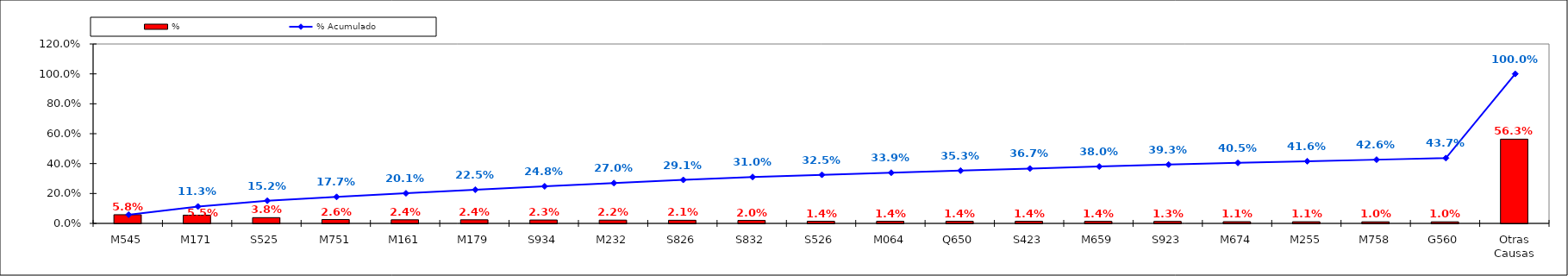
| Category | % |
|---|---|
| M545 | 0.058 |
| M171 | 0.055 |
| S525 | 0.038 |
| M751 | 0.026 |
| M161 | 0.024 |
| M179 | 0.024 |
| S934 | 0.023 |
| M232 | 0.022 |
| S826 | 0.021 |
| S832 | 0.02 |
| S526 | 0.014 |
| M064 | 0.014 |
| Q650 | 0.014 |
| S423 | 0.014 |
| M659 | 0.014 |
| S923 | 0.013 |
| M674 | 0.011 |
| M255 | 0.011 |
| M758 | 0.01 |
| G560 | 0.01 |
| Otras Causas | 0.563 |